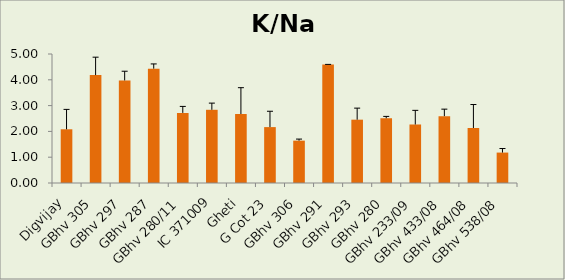
| Category | K/Na Ratio |
|---|---|
| Digvijay | 2.082 |
| GBhv 305 | 4.182 |
| GBhv 297 | 3.976 |
| GBhv 287 | 4.431 |
| GBhv 280/11 | 2.718 |
| IC 371009 | 2.838 |
| Gheti | 2.674 |
| G Cot 23 | 2.167 |
| GBhv 306 | 1.642 |
| GBhv 291 | 4.596 |
| GBhv 293 | 2.455 |
| GBhv 280 | 2.511 |
| GBhv 233/09 | 2.268 |
| GBhv 433/08 | 2.591 |
| GBhv 464/08 | 2.132 |
| GBhv 538/08 | 1.179 |